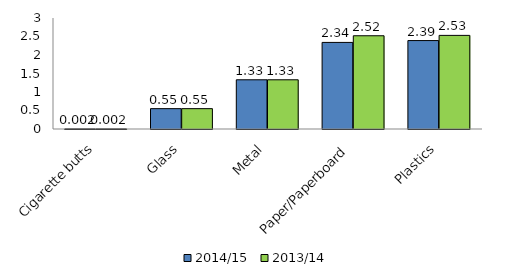
| Category | 2014/15 | 2013/14 |
|---|---|---|
| Cigarette butts | 0.002 | 0.002 |
| Glass | 0.55 | 0.55 |
| Metal | 1.33 | 1.33 |
| Paper/Paperboard | 2.34 | 2.52 |
| Plastics | 2.39 | 2.53 |